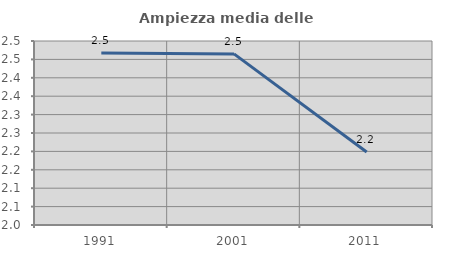
| Category | Ampiezza media delle famiglie |
|---|---|
| 1991.0 | 2.468 |
| 2001.0 | 2.465 |
| 2011.0 | 2.198 |